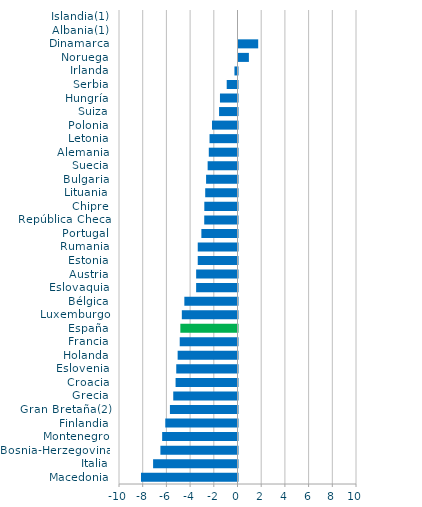
| Category | Series 0 |
|---|---|
| Macedonia | -8.144 |
| Italia | -7.123 |
| Bosnia-Herzegovina | -6.506 |
| Montenegro | -6.357 |
| Finlandia | -6.095 |
| Gran Bretaña(2) | -5.703 |
| Grecia | -5.422 |
| Croacia | -5.225 |
| Eslovenia | -5.169 |
| Holanda | -5.051 |
| Francia | -4.876 |
| España | -4.824 |
| Luxemburgo | -4.698 |
| Bélgica | -4.485 |
| Eslovaquia | -3.491 |
| Austria | -3.49 |
| Estonia | -3.355 |
| Rumania | -3.355 |
| Portugal | -3.049 |
| República Checa | -2.807 |
| Chipre | -2.8 |
| Lituania | -2.725 |
| Bulgaria | -2.651 |
| Suecia | -2.52 |
| Alemania | -2.423 |
| Letonia | -2.36 |
| Polonia | -2.151 |
| Suiza | -1.555 |
| Hungría | -1.48 |
| Serbia | -0.911 |
| Irlanda | -0.258 |
| Noruega | 0.876 |
| Dinamarca | 1.663 |
| Albania(1) | 0 |
| Islandia(1) | 0 |